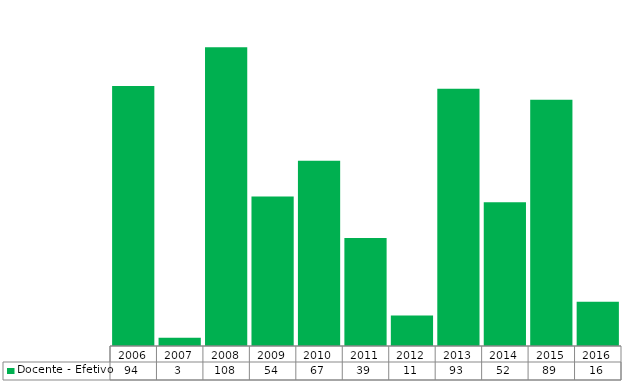
| Category | Docente - Efetivo |
|---|---|
| 2006.0 | 94 |
| 2007.0 | 3 |
| 2008.0 | 108 |
| 2009.0 | 54 |
| 2010.0 | 67 |
| 2011.0 | 39 |
| 2012.0 | 11 |
| 2013.0 | 93 |
| 2014.0 | 52 |
| 2015.0 | 89 |
| 2016.0 | 16 |